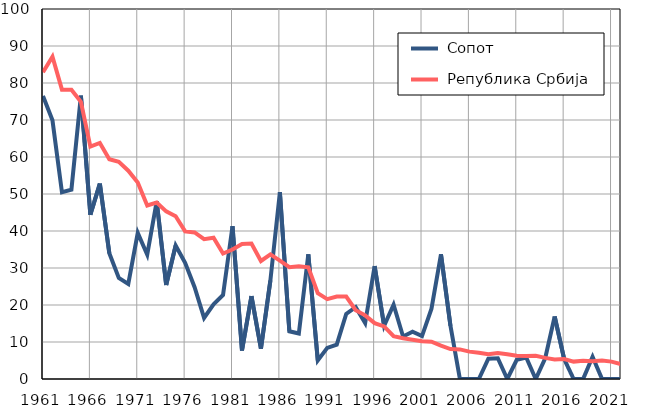
| Category |  Сопот |  Република Србија |
|---|---|---|
| 1961.0 | 76.5 | 82.9 |
| 1962.0 | 69.9 | 87.1 |
| 1963.0 | 50.5 | 78.2 |
| 1964.0 | 51.2 | 78.2 |
| 1965.0 | 76.6 | 74.9 |
| 1966.0 | 44.4 | 62.8 |
| 1967.0 | 52.8 | 63.8 |
| 1968.0 | 34 | 59.4 |
| 1969.0 | 27.3 | 58.7 |
| 1970.0 | 25.7 | 56.3 |
| 1971.0 | 39.5 | 53.1 |
| 1972.0 | 33.6 | 46.9 |
| 1973.0 | 48 | 47.7 |
| 1974.0 | 25.4 | 45.3 |
| 1975.0 | 36.1 | 44 |
| 1976.0 | 31.4 | 39.9 |
| 1977.0 | 24.8 | 39.6 |
| 1978.0 | 16.5 | 37.8 |
| 1979.0 | 20.2 | 38.2 |
| 1980.0 | 22.7 | 33.9 |
| 1981.0 | 41.3 | 35 |
| 1982.0 | 7.7 | 36.5 |
| 1983.0 | 22.4 | 36.6 |
| 1984.0 | 8.2 | 31.9 |
| 1985.0 | 26.7 | 33.7 |
| 1986.0 | 50.5 | 32 |
| 1987.0 | 12.9 | 30.2 |
| 1988.0 | 12.3 | 30.5 |
| 1989.0 | 33.7 | 30.2 |
| 1990.0 | 5 | 23.2 |
| 1991.0 | 8.4 | 21.6 |
| 1992.0 | 9.3 | 22.3 |
| 1993.0 | 17.6 | 22.3 |
| 1994.0 | 19.4 | 18.6 |
| 1995.0 | 15.1 | 17.2 |
| 1996.0 | 30.5 | 15.1 |
| 1997.0 | 14.4 | 14.2 |
| 1998.0 | 20.1 | 11.6 |
| 1999.0 | 11.5 | 11 |
| 2000.0 | 12.8 | 10.6 |
| 2001.0 | 11.6 | 10.2 |
| 2002.0 | 19 | 10.1 |
| 2003.0 | 33.7 | 9 |
| 2004.0 | 14.4 | 8.1 |
| 2005.0 | 0 | 8 |
| 2006.0 | 0 | 7.4 |
| 2007.0 | 0 | 7.1 |
| 2008.0 | 5.5 | 6.7 |
| 2009.0 | 5.6 | 7 |
| 2010.0 | 0 | 6.7 |
| 2011.0 | 5.2 | 6.3 |
| 2012.0 | 5.8 | 6.2 |
| 2013.0 | 0 | 6.3 |
| 2014.0 | 5.6 | 5.7 |
| 2015.0 | 16.9 | 5.3 |
| 2016.0 | 5.4 | 5.4 |
| 2017.0 | 0 | 4.7 |
| 2018.0 | 0 | 4.9 |
| 2019.0 | 6 | 4.8 |
| 2020.0 | 0 | 5 |
| 2021.0 | 0 | 4.7 |
| 2022.0 | 0 | 4 |